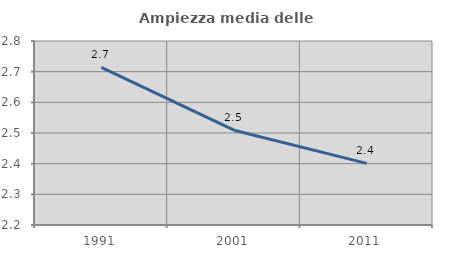
| Category | Ampiezza media delle famiglie |
|---|---|
| 1991.0 | 2.714 |
| 2001.0 | 2.509 |
| 2011.0 | 2.401 |